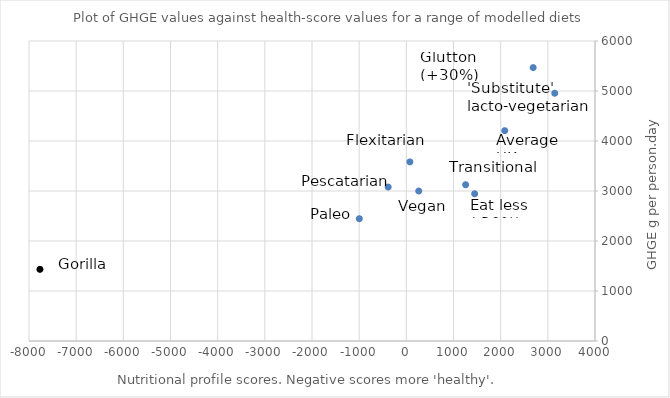
| Category | Series 0 |
|---|---|
| 2086.0 | 4207 |
| 2689.0 | 5468 |
| 1448.0 | 2945 |
| -7768.0 | 1433 |
| -385.0 | 3079 |
| 1257.0 | 3125 |
| 3146.0 | 4955 |
| 75.0 | 3582 |
| 263.0 | 2999 |
| -997.0 | 2446 |